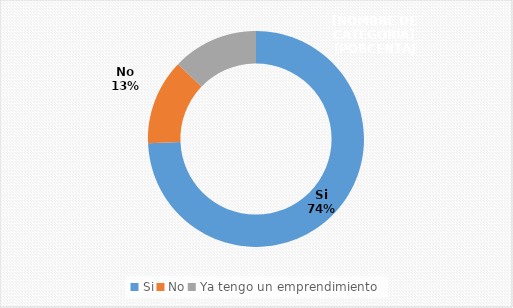
| Category | Series 0 |
|---|---|
| Si | 0.744 |
| No | 0.128 |
| Ya tengo un emprendimiento | 0.128 |